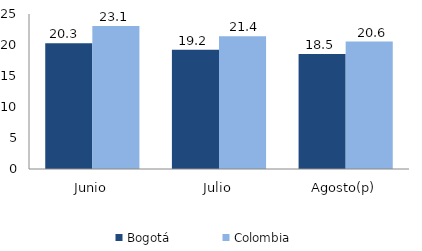
| Category | Bogotá | Colombia |
|---|---|---|
| Junio | 20.294 | 23.059 |
| Julio | 19.245 | 21.398 |
| Agosto(p) | 18.546 | 20.563 |